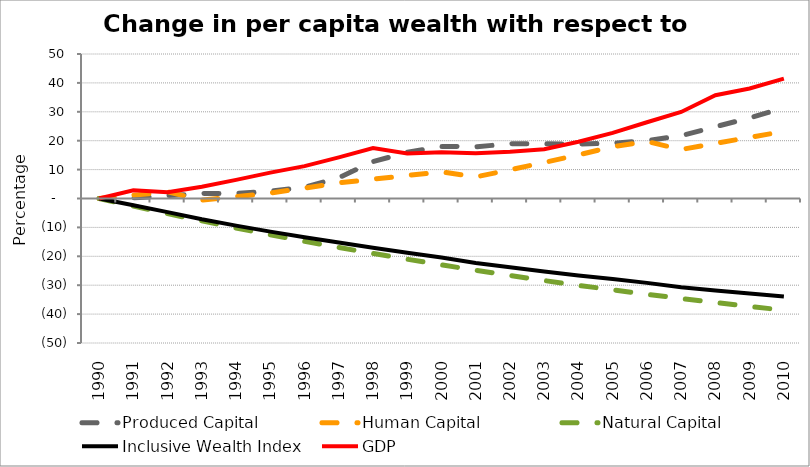
| Category | Produced Capital  | Human Capital | Natural Capital | Inclusive Wealth Index | GDP |
|---|---|---|---|---|---|
| 1990.0 | 0 | 0 | 0 | 0 | 0 |
| 1991.0 | 0.201 | 1.151 | -2.626 | -2.356 | 2.863 |
| 1992.0 | 0.979 | 2.282 | -5.252 | -4.706 | 2.155 |
| 1993.0 | 1.728 | -0.541 | -7.754 | -7.187 | 4.066 |
| 1994.0 | 1.746 | 0.623 | -10.205 | -9.383 | 6.453 |
| 1995.0 | 2.513 | 1.88 | -12.555 | -11.47 | 8.942 |
| 1996.0 | 3.934 | 3.602 | -14.813 | -13.435 | 11.215 |
| 1997.0 | 7.158 | 5.424 | -16.947 | -15.256 | 14.231 |
| 1998.0 | 12.754 | 6.673 | -19.018 | -17.025 | 17.464 |
| 1999.0 | 16.002 | 7.945 | -21.02 | -18.758 | 15.537 |
| 2000.0 | 18.018 | 9.206 | -22.955 | -20.445 | 16.033 |
| 2001.0 | 17.894 | 7.455 | -24.823 | -22.284 | 15.628 |
| 2002.0 | 18.926 | 9.929 | -26.611 | -23.772 | 16.173 |
| 2003.0 | 18.948 | 12.446 | -28.398 | -25.269 | 17.032 |
| 2004.0 | 18.832 | 15.104 | -30.054 | -26.638 | 19.649 |
| 2005.0 | 19.123 | 17.938 | -31.583 | -27.873 | 22.703 |
| 2006.0 | 20.005 | 19.72 | -33.146 | -29.198 | 26.378 |
| 2007.0 | 21.728 | 16.967 | -34.589 | -30.683 | 29.956 |
| 2008.0 | 24.822 | 19.054 | -35.99 | -31.81 | 35.724 |
| 2009.0 | 27.899 | 21.16 | -37.327 | -32.878 | 38.056 |
| 2010.0 | 31.394 | 23.196 | -38.647 | -33.93 | 41.489 |